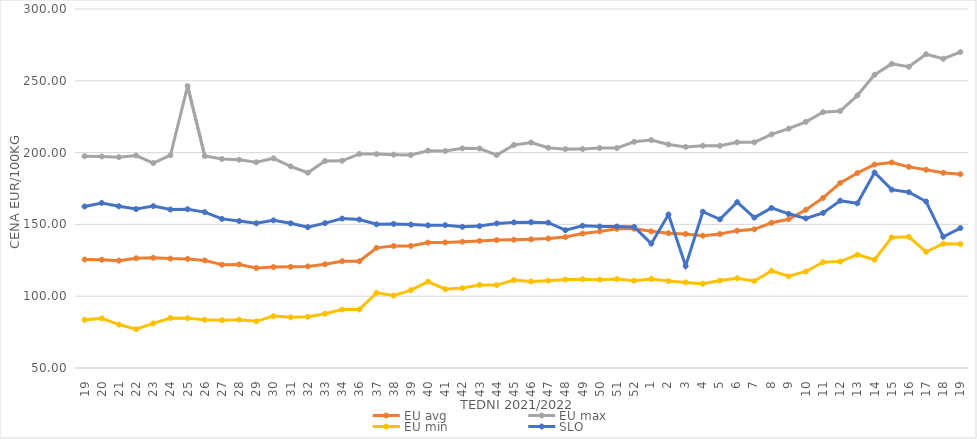
| Category | EU avg | EU max | EU min | SLO |
|---|---|---|---|---|
| 19.0 | 125.54 | 197.478 | 83.546 | 162.44 |
| 20.0 | 125.412 | 197.263 | 84.55 | 164.94 |
| 21.0 | 124.768 | 196.821 | 80.264 | 162.64 |
| 22.0 | 126.43 | 197.963 | 77.048 | 160.68 |
| 23.0 | 126.76 | 192.72 | 81.087 | 162.75 |
| 24.0 | 126.19 | 198.186 | 84.83 | 160.34 |
| 25.0 | 125.97 | 246.36 | 84.63 | 160.6 |
| 26.0 | 124.92 | 197.607 | 83.57 | 158.57 |
| 27.0 | 121.922 | 195.566 | 83.3 | 153.83 |
| 28.0 | 122.106 | 195.043 | 83.64 | 152.35 |
| 29.0 | 119.659 | 193.272 | 82.49 | 150.79 |
| 30.0 | 120.3 | 196.01 | 86.16 | 152.82 |
| 31.0 | 120.473 | 190.42 | 85.26 | 150.8 |
| 32.0 | 120.756 | 186 | 85.65 | 148.1 |
| 33.0 | 122.274 | 194.145 | 87.8 | 150.88 |
| 34.0 | 124.332 | 194.304 | 90.69 | 154.04 |
| 36.0 | 124.332 | 199.06 | 90.69 | 153.37 |
| 37.0 | 133.685 | 198.97 | 102.334 | 150.06 |
| 38.0 | 134.959 | 198.57 | 100.43 | 150.32 |
| 39.0 | 135.021 | 198.3 | 104.21 | 149.86 |
| 40.0 | 137.315 | 201.34 | 110.15 | 149.34 |
| 41.0 | 137.411 | 201.081 | 104.9 | 149.48 |
| 42.0 | 137.908 | 202.98 | 105.65 | 148.32 |
| 43.0 | 138.52 | 202.856 | 107.8 | 148.83 |
| 44.0 | 139.076 | 198.26 | 107.75 | 150.69 |
| 45.0 | 139.275 | 205.257 | 111.25 | 151.41 |
| 46.0 | 139.626 | 207.046 | 110.26 | 151.56 |
| 47.0 | 140.17 | 203.387 | 110.83 | 151.2 |
| 48.0 | 141.2 | 202.42 | 111.62 | 145.97 |
| 49.0 | 143.614 | 202.45 | 111.89 | 149.07 |
| 50.0 | 145.101 | 203.17 | 111.54 | 148.55 |
| 51.0 | 146.984 | 203.17 | 111.93 | 148.54 |
| 52.0 | 146.958 | 207.5 | 110.85 | 148.22 |
| 1.0 | 145.157 | 208.7 | 112.04 | 136.59 |
| 2.0 | 143.842 | 205.67 | 110.59 | 156.88 |
| 3.0 | 143.324 | 203.97 | 109.62 | 121.07 |
| 4.0 | 142.105 | 204.76 | 108.71 | 158.82 |
| 5.0 | 143.269 | 204.76 | 110.86 | 153.55 |
| 6.0 | 145.648 | 207.14 | 112.52 | 165.51 |
| 7.0 | 146.545 | 207.14 | 110.619 | 154.74 |
| 8.0 | 151.148 | 212.7 | 117.709 | 161.48 |
| 9.0 | 153.62 | 216.67 | 113.871 | 157.38 |
| 10.0 | 160.142 | 221.43 | 117.233 | 154.16 |
| 11.0 | 168.433 | 228.17 | 123.737 | 157.96 |
| 12.0 | 178.919 | 228.97 | 124.105 | 166.49 |
| 13.0 | 185.792 | 239.77 | 128.918 | 164.66 |
| 14.0 | 191.659 | 254.21 | 125.399 | 186.11 |
| 15.0 | 193.148 | 261.79 | 140.954 | 174.18 |
| 16.0 | 190.066 | 259.76 | 141.337 | 172.42 |
| 17.0 | 188.031 | 268.52 | 130.897 | 165.96 |
| 18.0 | 185.925 | 265.34 | 136.529 | 141.36 |
| 19.0 | 184.944 | 270.01 | 136.387 | 147.43 |